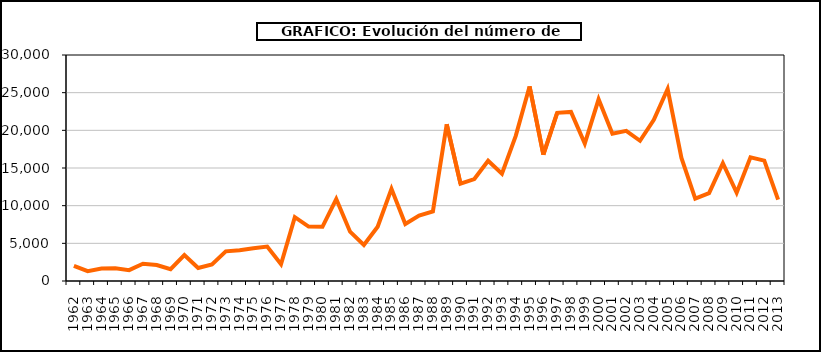
| Category | Series 0 |
|---|---|
| 1962.0 | 2022 |
| 1963.0 | 1302 |
| 1964.0 | 1645 |
| 1965.0 | 1686 |
| 1966.0 | 1443 |
| 1967.0 | 2299 |
| 1968.0 | 2115 |
| 1969.0 | 1558 |
| 1970.0 | 3450 |
| 1971.0 | 1718 |
| 1972.0 | 2194 |
| 1973.0 | 3932 |
| 1974.0 | 4088 |
| 1975.0 | 4340 |
| 1976.0 | 4577 |
| 1977.0 | 2221 |
| 1978.0 | 8471 |
| 1979.0 | 7222 |
| 1980.0 | 7190 |
| 1981.0 | 10878 |
| 1982.0 | 6545 |
| 1983.0 | 4791 |
| 1984.0 | 7203 |
| 1985.0 | 12238 |
| 1986.0 | 7570 |
| 1987.0 | 8679 |
| 1988.0 | 9247 |
| 1989.0 | 20811 |
| 1990.0 | 12913 |
| 1991.0 | 13531 |
| 1992.0 | 15955 |
| 1993.0 | 14254 |
| 1994.0 | 19263 |
| 1995.0 | 25827 |
| 1996.0 | 16771 |
| 1997.0 | 22320 |
| 1998.0 | 22446 |
| 1999.0 | 18237 |
| 2000.0 | 24118 |
| 2001.0 | 19547 |
| 2002.0 | 19929 |
| 2003.0 | 18616 |
| 2004.0 | 21396 |
| 2005.0 | 25492 |
| 2006.0 | 16334 |
| 2007.0 | 10932 |
| 2008.0 | 11656 |
| 2009.0 | 15642 |
| 2010.0 | 11722 |
| 2011.0 | 16414 |
| 2012.0 | 15978 |
| 2013.0 | 10797 |